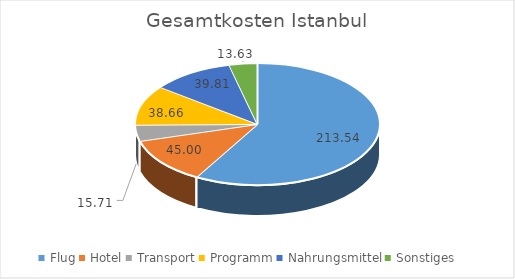
| Category | Series 0 |
|---|---|
| Flug | 213.54 |
| Hotel | 45 |
| Transport | 15.706 |
| Programm | 38.66 |
| Nahrungsmittel | 39.808 |
| Sonstiges | 13.625 |